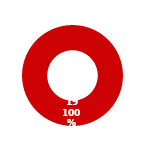
| Category | IR |
|---|---|
| MIL 3 Complete | 0 |
| MIL 3 Not Complete | 19 |